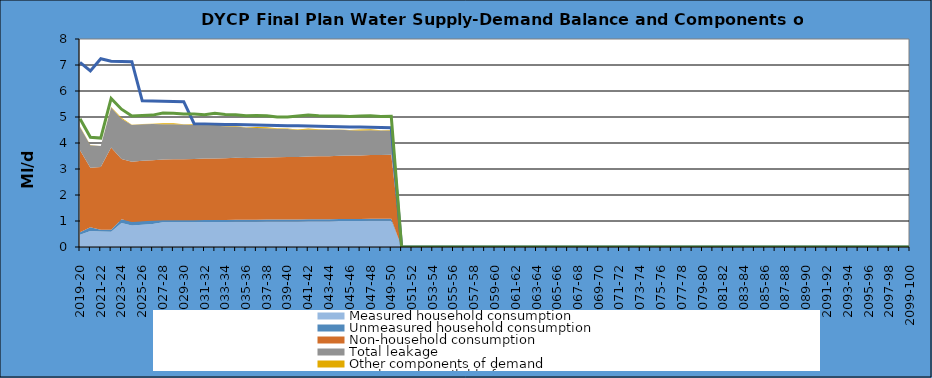
| Category | Total water available for use | Total demand + target headroom (final plan) |
|---|---|---|
| 0 | 7.1 | 4.93 |
| 1 | 6.77 | 4.22 |
| 2 | 7.24 | 4.188 |
| 3 | 7.144 | 5.712 |
| 4 | 7.136 | 5.3 |
| 5 | 7.128 | 5.036 |
| 6 | 5.62 | 5.059 |
| 7 | 5.612 | 5.073 |
| 8 | 5.604 | 5.152 |
| 9 | 5.596 | 5.145 |
| 10 | 5.588 | 5.114 |
| 11 | 4.74 | 5.111 |
| 12 | 4.732 | 5.087 |
| 13 | 4.724 | 5.143 |
| 14 | 4.716 | 5.1 |
| 15 | 4.708 | 5.091 |
| 16 | 4.7 | 5.05 |
| 17 | 4.692 | 5.057 |
| 18 | 4.684 | 5.048 |
| 19 | 4.676 | 5.004 |
| 20 | 4.668 | 5.001 |
| 21 | 4.66 | 5.035 |
| 22 | 4.652 | 5.076 |
| 23 | 4.644 | 5.045 |
| 24 | 4.636 | 5.038 |
| 25 | 4.628 | 5.042 |
| 26 | 4.62 | 5.023 |
| 27 | 4.612 | 5.042 |
| 28 | 4.604 | 5.046 |
| 29 | 4.596 | 5.015 |
| 30 | 4.588 | 5.023 |
| 31 | 0 | 0 |
| 32 | 0 | 0 |
| 33 | 0 | 0 |
| 34 | 0 | 0 |
| 35 | 0 | 0 |
| 36 | 0 | 0 |
| 37 | 0 | 0 |
| 38 | 0 | 0 |
| 39 | 0 | 0 |
| 40 | 0 | 0 |
| 41 | 0 | 0 |
| 42 | 0 | 0 |
| 43 | 0 | 0 |
| 44 | 0 | 0 |
| 45 | 0 | 0 |
| 46 | 0 | 0 |
| 47 | 0 | 0 |
| 48 | 0 | 0 |
| 49 | 0 | 0 |
| 50 | 0 | 0 |
| 51 | 0 | 0 |
| 52 | 0 | 0 |
| 53 | 0 | 0 |
| 54 | 0 | 0 |
| 55 | 0 | 0 |
| 56 | 0 | 0 |
| 57 | 0 | 0 |
| 58 | 0 | 0 |
| 59 | 0 | 0 |
| 60 | 0 | 0 |
| 61 | 0 | 0 |
| 62 | 0 | 0 |
| 63 | 0 | 0 |
| 64 | 0 | 0 |
| 65 | 0 | 0 |
| 66 | 0 | 0 |
| 67 | 0 | 0 |
| 68 | 0 | 0 |
| 69 | 0 | 0 |
| 70 | 0 | 0 |
| 71 | 0 | 0 |
| 72 | 0 | 0 |
| 73 | 0 | 0 |
| 74 | 0 | 0 |
| 75 | 0 | 0 |
| 76 | 0 | 0 |
| 77 | 0 | 0 |
| 78 | 0 | 0 |
| 79 | 0 | 0 |
| 80 | 0 | 0 |